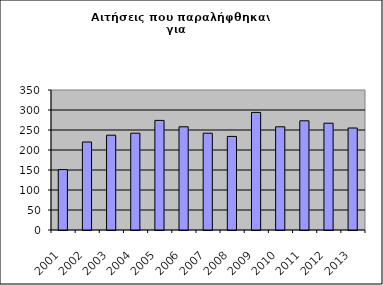
| Category | Series 1 |
|---|---|
| 2001.0 | 151 |
| 2002.0 | 220 |
| 2003.0 | 237 |
| 2004.0 | 242 |
| 2005.0 | 274 |
| 2006.0 | 258 |
| 2007.0 | 242 |
| 2008.0 | 234 |
| 2009.0 | 294 |
| 2010.0 | 258 |
| 2011.0 | 273 |
| 2012.0 | 267 |
| 2013.0 | 255 |